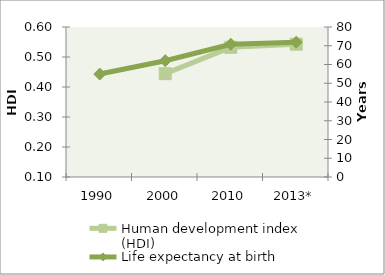
| Category | Human development index (HDI) |
|---|---|
| 1990 | 0 |
| 2000 | 0.444 |
| 2010 | 0.532 |
| 2013* | 0.543 |